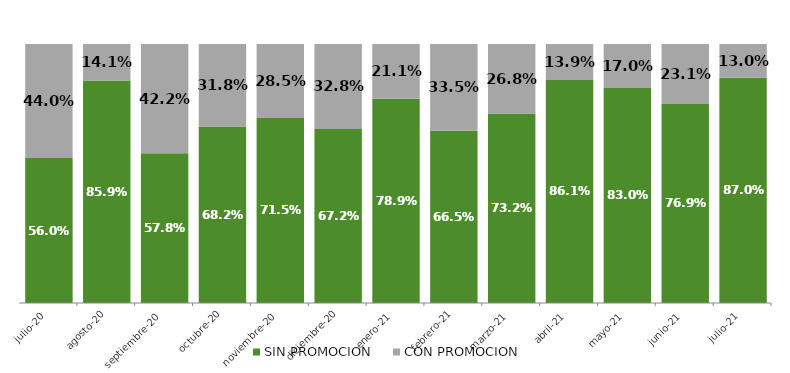
| Category | SIN PROMOCION   | CON PROMOCION   |
|---|---|---|
| 2020-07-01 | 0.56 | 0.44 |
| 2020-08-01 | 0.859 | 0.141 |
| 2020-09-01 | 0.578 | 0.422 |
| 2020-10-01 | 0.682 | 0.318 |
| 2020-11-01 | 0.715 | 0.285 |
| 2020-12-01 | 0.672 | 0.328 |
| 2021-01-01 | 0.789 | 0.211 |
| 2021-02-01 | 0.665 | 0.335 |
| 2021-03-01 | 0.732 | 0.268 |
| 2021-04-01 | 0.861 | 0.139 |
| 2021-05-01 | 0.83 | 0.17 |
| 2021-06-01 | 0.769 | 0.231 |
| 2021-07-01 | 0.87 | 0.13 |